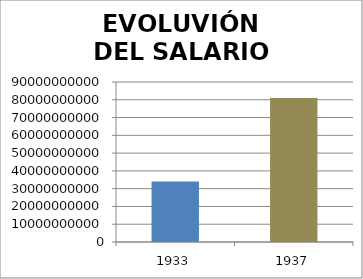
| Category | SALARIO |
|---|---|
| 1933.0 | 34000000000 |
| 1937.0 | 81000000000 |